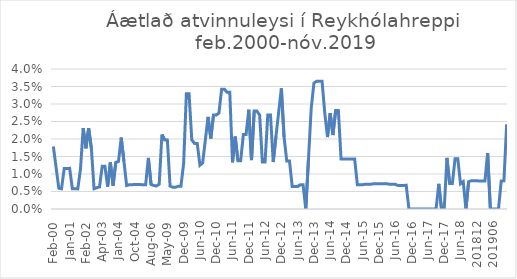
| Category | Áætlað atvinnuleysi |
|---|---|
| feb.00 | 0.018 |
| apr.00 | 0.012 |
| maí.00 | 0.006 |
| júl.00 | 0.006 |
| ágú.00 | 0.012 |
| sep.00 | 0.012 |
| jan.01 | 0.012 |
| feb.01 | 0.006 |
| mar.01 | 0.006 |
| nóv.01 | 0.006 |
| des.01 | 0.011 |
| jan.02 | 0.023 |
| feb.02 | 0.017 |
| mar.02 | 0.023 |
| apr.02 | 0.017 |
| maí.02 | 0.006 |
| okt.02 | 0.006 |
| mar.03 | 0.006 |
| apr.03 | 0.012 |
| maí.03 | 0.012 |
| sep.03 | 0.006 |
| okt.03 | 0.013 |
| nóv.03 | 0.007 |
| des.03 | 0.013 |
| jan.04 | 0.014 |
| feb.04 | 0.02 |
| mar.04 | 0.014 |
| apr.04 | 0.007 |
| júl.04 | 0.007 |
| ágú.04 | 0.007 |
| okt.04 | 0.007 |
| 200501 | 0.007 |
| 200502 | 0.007 |
| apr.05 | 0.007 |
| jún.05 | 0.007 |
| júl.05 | 0.015 |
| ágú.06 | 0.007 |
| júl.07 | 0.007 |
| jún.08 | 0.007 |
| jan.09 | 0.007 |
| feb.09 | 0.021 |
| apr.09 | 0.02 |
| maí.09 | 0.02 |
| jún.09 | 0.007 |
| júl.09 | 0.006 |
| ágú.09 | 0.006 |
| okt.09 | 0.006 |
| nóv.09 | 0.006 |
| des.09 | 0.013 |
| jan.10 | 0.033 |
| feb.10 | 0.033 |
| mar.10 | 0.02 |
| apr.10 | 0.019 |
| maí.10 | 0.019 |
| jún.10 | 0.012 |
| júl.10 | 0.013 |
| ágú.10 | 0.02 |
| sep.10 | 0.026 |
| okt.10 | 0.02 |
| nóv.10 | 0.027 |
| des.10 | 0.027 |
| jan.11 | 0.027 |
| feb.11 | 0.034 |
| mar.11 | 0.034 |
| apr.11 | 0.033 |
| maí.11 | 0.033 |
| jún.11 | 0.013 |
| júl.11 | 0.021 |
| ágú.11 | 0.014 |
| sep.11 | 0.014 |
| okt.11 | 0.021 |
| nóv.11 | 0.021 |
| des.11 | 0.028 |
| jan.12 | 0.014 |
| feb.12 | 0.028 |
| mar.12 | 0.028 |
| apr.12 | 0.027 |
| maí.12 | 0.013 |
| jún.12 | 0.013 |
| júl.12 | 0.027 |
| ágú.12 | 0.027 |
| sep.12 | 0.013 |
| okt.12 | 0.021 |
| nóv.12 | 0.028 |
| des.12 | 0.034 |
| jan.13 | 0.021 |
| feb.13 | 0.014 |
| mar.13 | 0.014 |
| apr.13 | 0.006 |
| maí.13 | 0.006 |
| jún.13 | 0.006 |
| júl.13 | 0.007 |
| ágú.13 | 0.007 |
| sep.13 | 0 |
| okt.13 | 0.014 |
| nóv.13 | 0.029 |
| des.13 | 0.036 |
| jan.14 | 0.036 |
| feb.14 | 0.036 |
| mar.14 | 0.036 |
| apr.14 | 0.027 |
| maí.14 | 0.021 |
| jún.14 | 0.027 |
| júl.14 | 0.021 |
| ágú.14 | 0.028 |
| sep.14 | 0.028 |
| okt.14 | 0.014 |
| nóv.14 | 0.014 |
| des.14 | 0.014 |
| jan.15 | 0.014 |
| feb.15 | 0.014 |
| mar.15 | 0.014 |
| apr.15 | 0.007 |
| maí.15 | 0.007 |
| jún.15 | 0.007 |
| júl.15 | 0.007 |
| ágú.15 | 0.007 |
| sep.15 | 0.007 |
| okt.15 | 0.007 |
| nóv.15 | 0.007 |
| des.15 | 0.007 |
| jan.16 | 0.007 |
| feb.16 | 0.007 |
| mar.16 | 0.007 |
| apr.16 | 0.007 |
| maí.16 | 0.007 |
| jún.16 | 0.007 |
| júl.16 | 0.007 |
| ágú.16 | 0.007 |
| sep.16 | 0.007 |
| okt.16 | 0.007 |
| nóv.16 | 0 |
| des.16 | 0 |
| jan.17 | 0 |
| feb.17 | 0 |
| mar.17 | 0 |
| apr.17 | 0 |
| maí.17 | 0 |
| jún.17 | 0 |
| júl.17 | 0 |
| ágú.17 | 0 |
| sep.17 | 0 |
| okt.17 | 0.007 |
| nóv.17 | 0 |
| des.17 | 0 |
| jan.18 | 0.015 |
| feb.18 | 0.007 |
| mar.18 | 0.007 |
| apr.18 | 0.014 |
| maí.18 | 0.014 |
| jún.18 | 0.007 |
| júl.18 | 0.008 |
| ágú.18 | 0 |
| 201809 | 0.008 |
| 201810 | 0.008 |
| 201811 | 0.008 |
| 201812 | 0.008 |
| 201901 | 0.008 |
| 201902 | 0.008 |
| 201903 | 0.008 |
| 201904 | 0.016 |
| 201905 | 0 |
| 201906 | 0 |
| 201907 | 0 |
| 201908 | 0 |
| 201909 | 0.008 |
| 201910 | 0.008 |
| 201911 | 0.024 |